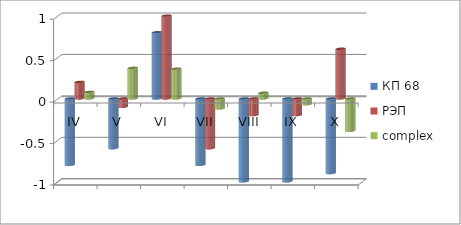
| Category | КП 68 | РЭП  | complex |
|---|---|---|---|
| IV | -0.8 | 0.2 | 0.08 |
| V | -0.6 | -0.1 | 0.37 |
| VI | 0.8 | 1 | 0.36 |
| VII | -0.8 | -0.6 | -0.12 |
| VIII | -1 | -0.2 | 0.07 |
| IX | -1 | -0.2 | -0.07 |
| X | -0.9 | 0.6 | -0.39 |